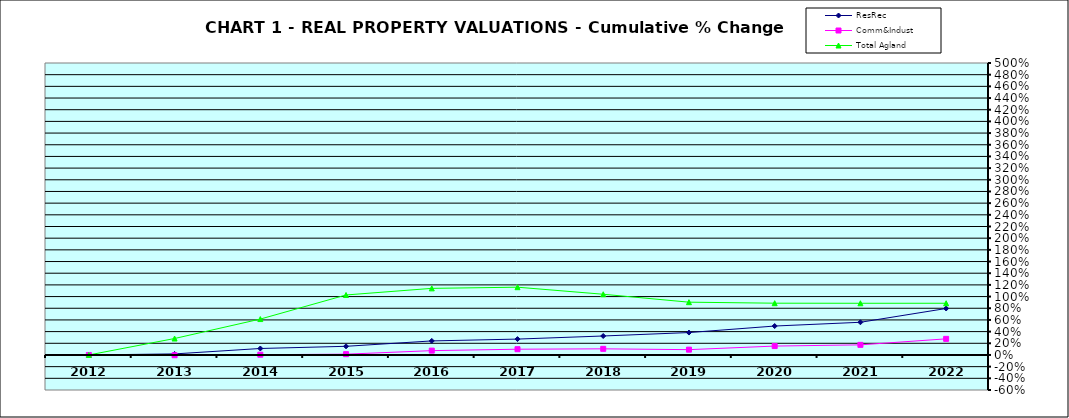
| Category | ResRec | Comm&Indust | Total Agland |
|---|---|---|---|
| 2012.0 | 0 | 0 | 0 |
| 2013.0 | 0.018 | -0.005 | 0.282 |
| 2014.0 | 0.111 | 0.005 | 0.615 |
| 2015.0 | 0.148 | 0.014 | 1.027 |
| 2016.0 | 0.24 | 0.074 | 1.141 |
| 2017.0 | 0.272 | 0.099 | 1.161 |
| 2018.0 | 0.325 | 0.105 | 1.04 |
| 2019.0 | 0.384 | 0.091 | 0.904 |
| 2020.0 | 0.495 | 0.152 | 0.887 |
| 2021.0 | 0.56 | 0.173 | 0.885 |
| 2022.0 | 0.796 | 0.276 | 0.885 |